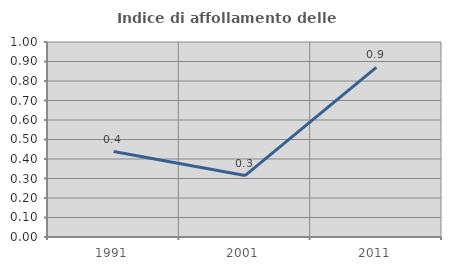
| Category | Indice di affollamento delle abitazioni  |
|---|---|
| 1991.0 | 0.438 |
| 2001.0 | 0.315 |
| 2011.0 | 0.87 |